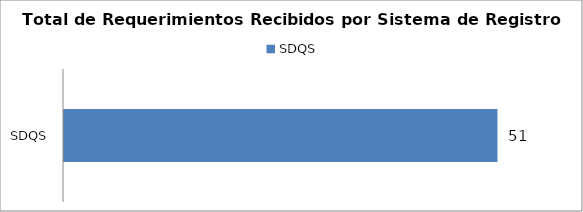
| Category | Total |
|---|---|
| SDQS | 51 |